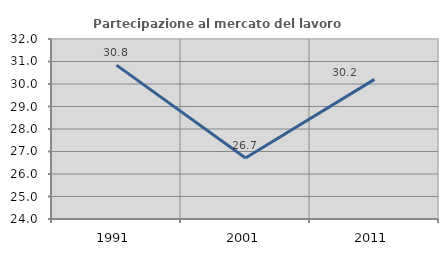
| Category | Partecipazione al mercato del lavoro  femminile |
|---|---|
| 1991.0 | 30.839 |
| 2001.0 | 26.712 |
| 2011.0 | 30.205 |